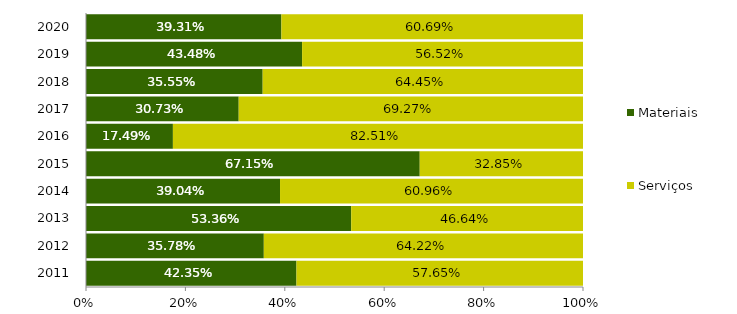
| Category | Materiais | Serviços |
|---|---|---|
| 2011.0 | 0.423 | 0.577 |
| 2012.0 | 0.358 | 0.642 |
| 2013.0 | 0.534 | 0.466 |
| 2014.0 | 0.39 | 0.61 |
| 2015.0 | 0.671 | 0.329 |
| 2016.0 | 0.175 | 0.825 |
| 2017.0 | 0.307 | 0.693 |
| 2018.0 | 0.355 | 0.645 |
| 2019.0 | 0.435 | 0.565 |
| 2020.0 | 0.393 | 0.607 |